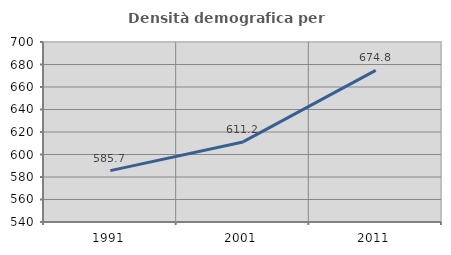
| Category | Densità demografica |
|---|---|
| 1991.0 | 585.671 |
| 2001.0 | 611.189 |
| 2011.0 | 674.809 |